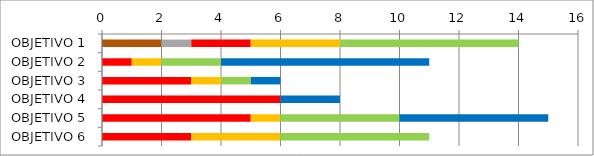
| Category | Series 0 | Series 1 | Series 2 | Series 3 | Series 4 | Series 5 |
|---|---|---|---|---|---|---|
| OBJETIVO 1 | 2 | 1 | 2 | 3 | 6 | 0 |
| OBJETIVO 2 | 0 | 0 | 1 | 1 | 2 | 7 |
| OBJETIVO 3 | 0 | 0 | 3 | 1 | 1 | 1 |
| OBJETIVO 4 | 0 | 0 | 6 | 0 | 0 | 2 |
| OBJETIVO 5 | 0 | 0 | 5 | 1 | 4 | 5 |
| OBJETIVO 6 | 0 | 0 | 3 | 3 | 5 | 0 |